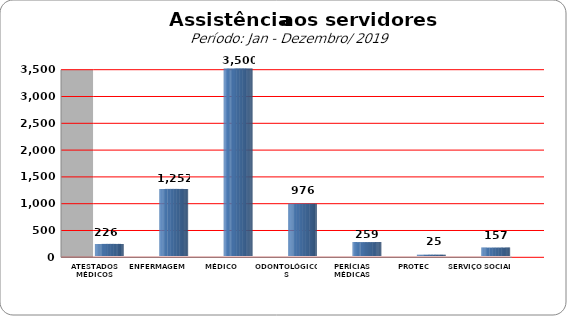
| Category | Series 0 |
|---|---|
| ATESTADOS MÉDICOS | 226 |
| ENFERMAGEM | 1252 |
| MÉDICO | 3500 |
| ODONTOLÓGICOS | 976 |
| PERÍCIAS MÉDICAS | 259 |
| PROTEC | 25 |
| SERVIÇO SOCIAL | 157 |